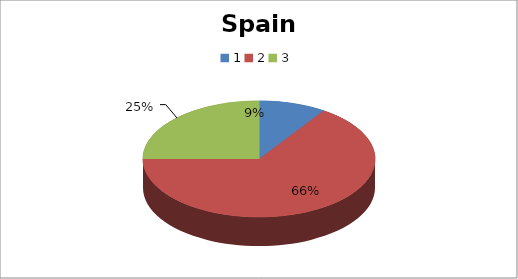
| Category | Spain |
|---|---|
| 0 | 3 |
| 1 | 21 |
| 2 | 8 |